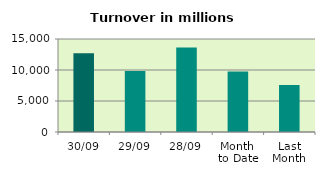
| Category | Series 0 |
|---|---|
| 30/09 | 12692.888 |
| 29/09 | 9827.464 |
| 28/09 | 13614.071 |
| Month 
to Date | 9769.37 |
| Last
Month | 7565.704 |